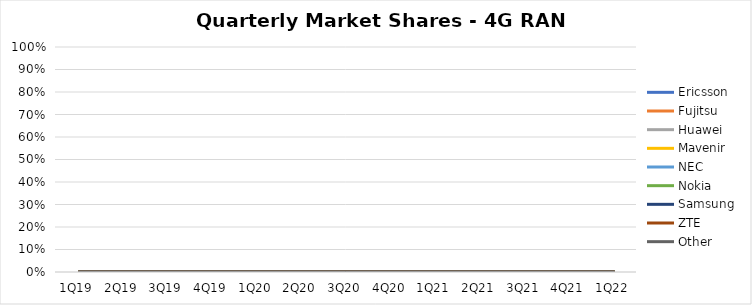
| Category | Ericsson | Fujitsu | Huawei | Mavenir | NEC | Nokia | Samsung | ZTE | Other |
|---|---|---|---|---|---|---|---|---|---|
| 1Q19 | 0 | 0 | 0 | 0 | 0 | 0 | 0 | 0 | 0 |
| 2Q19 | 0 | 0 | 0 | 0 | 0 | 0 | 0 | 0 | 0 |
| 3Q19 | 0 | 0 | 0 | 0 | 0 | 0 | 0 | 0 | 0 |
| 4Q19 | 0 | 0 | 0 | 0 | 0 | 0 | 0 | 0 | 0 |
| 1Q20 | 0 | 0 | 0 | 0 | 0 | 0 | 0 | 0 | 0 |
| 2Q20 | 0 | 0 | 0 | 0 | 0 | 0 | 0 | 0 | 0 |
| 3Q20 | 0 | 0 | 0 | 0 | 0 | 0 | 0 | 0 | 0 |
| 4Q20 | 0 | 0 | 0 | 0 | 0 | 0 | 0 | 0 | 0 |
| 1Q21 | 0 | 0 | 0 | 0 | 0 | 0 | 0 | 0 | 0 |
| 2Q21 | 0 | 0 | 0 | 0 | 0 | 0 | 0 | 0 | 0 |
| 3Q21 | 0 | 0 | 0 | 0 | 0 | 0 | 0 | 0 | 0 |
| 4Q21 | 0 | 0 | 0 | 0 | 0 | 0 | 0 | 0 | 0 |
| 1Q22 | 0 | 0 | 0 | 0 | 0 | 0 | 0 | 0 | 0 |